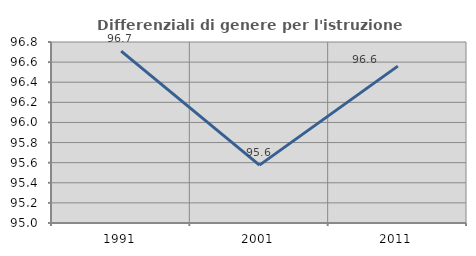
| Category | Differenziali di genere per l'istruzione superiore |
|---|---|
| 1991.0 | 96.709 |
| 2001.0 | 95.575 |
| 2011.0 | 96.56 |